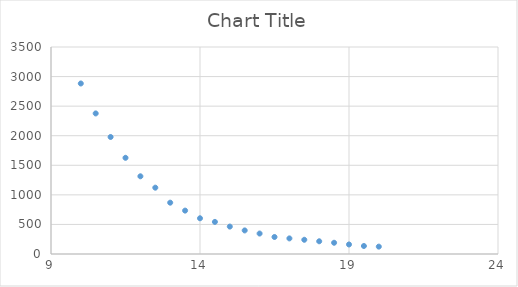
| Category | Series 0 |
|---|---|
| 20.0 | 124.59 |
| 19.5 | 135.28 |
| 19.0 | 161.13 |
| 18.5 | 189.97 |
| 18.0 | 215.11 |
| 17.5 | 240.53 |
| 17.0 | 263.79 |
| 16.5 | 287.66 |
| 16.0 | 346.06 |
| 15.5 | 398.5 |
| 15.0 | 463.76 |
| 14.5 | 542.6 |
| 14.0 | 604.2 |
| 13.5 | 733.58 |
| 13.0 | 867.73 |
| 12.5 | 1121.53 |
| 12.0 | 1313.84 |
| 11.5 | 1626.61 |
| 11.0 | 1978.51 |
| 10.5 | 2376.74 |
| 10.0 | 2883.09 |